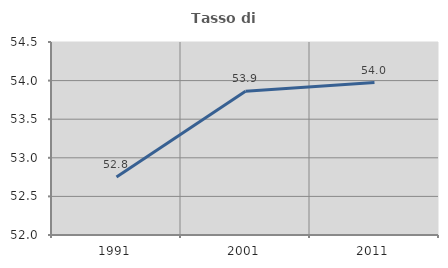
| Category | Tasso di occupazione   |
|---|---|
| 1991.0 | 52.753 |
| 2001.0 | 53.862 |
| 2011.0 | 53.975 |